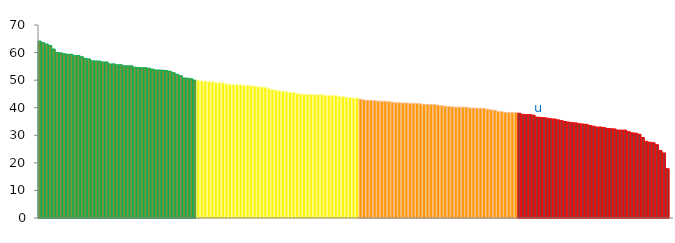
| Category | Top Quartile | 2nd Quartile | 3rd Quartile | Bottom Quartile | Series 4 |
|---|---|---|---|---|---|
|  | 64.2 | 0 | 0 | 0 | 64.2 |
|  | 63.6 | 0 | 0 | 0 | 63.6 |
|  | 63.1 | 0 | 0 | 0 | 63.1 |
|  | 62.6 | 0 | 0 | 0 | 62.6 |
|  | 61.3 | 0 | 0 | 0 | 61.3 |
|  | 60 | 0 | 0 | 0 | 60 |
|  | 59.9 | 0 | 0 | 0 | 59.9 |
|  | 59.6 | 0 | 0 | 0 | 59.6 |
|  | 59.4 | 0 | 0 | 0 | 59.4 |
|  | 59.4 | 0 | 0 | 0 | 59.4 |
|  | 58.9 | 0 | 0 | 0 | 58.9 |
|  | 58.9 | 0 | 0 | 0 | 58.9 |
|  | 58.5 | 0 | 0 | 0 | 58.5 |
|  | 57.9 | 0 | 0 | 0 | 57.9 |
|  | 57.7 | 0 | 0 | 0 | 57.7 |
|  | 57 | 0 | 0 | 0 | 57 |
|  | 57 | 0 | 0 | 0 | 57 |
|  | 56.9 | 0 | 0 | 0 | 56.9 |
|  | 56.6 | 0 | 0 | 0 | 56.6 |
|  | 56.6 | 0 | 0 | 0 | 56.6 |
|  | 55.9 | 0 | 0 | 0 | 55.9 |
|  | 55.9 | 0 | 0 | 0 | 55.9 |
|  | 55.6 | 0 | 0 | 0 | 55.6 |
|  | 55.6 | 0 | 0 | 0 | 55.6 |
|  | 55.2 | 0 | 0 | 0 | 55.2 |
|  | 55.2 | 0 | 0 | 0 | 55.2 |
|  | 55.2 | 0 | 0 | 0 | 55.2 |
|  | 54.7 | 0 | 0 | 0 | 54.7 |
|  | 54.6 | 0 | 0 | 0 | 54.6 |
|  | 54.5 | 0 | 0 | 0 | 54.5 |
|  | 54.5 | 0 | 0 | 0 | 54.5 |
|  | 54.3 | 0 | 0 | 0 | 54.3 |
|  | 54 | 0 | 0 | 0 | 54 |
|  | 53.7 | 0 | 0 | 0 | 53.7 |
|  | 53.7 | 0 | 0 | 0 | 53.7 |
|  | 53.6 | 0 | 0 | 0 | 53.6 |
|  | 53.5 | 0 | 0 | 0 | 53.5 |
|  | 53.2 | 0 | 0 | 0 | 53.2 |
|  | 52.7 | 0 | 0 | 0 | 52.7 |
|  | 52.1 | 0 | 0 | 0 | 52.1 |
|  | 51.6 | 0 | 0 | 0 | 51.6 |
|  | 50.8 | 0 | 0 | 0 | 50.8 |
|  | 50.7 | 0 | 0 | 0 | 50.7 |
|  | 50.5 | 0 | 0 | 0 | 50.5 |
|  | 50 | 0 | 0 | 0 | 50 |
|  | 0 | 49.9 | 0 | 0 | 49.9 |
|  | 0 | 49.7 | 0 | 0 | 49.7 |
|  | 0 | 49.6 | 0 | 0 | 49.6 |
|  | 0 | 49.4 | 0 | 0 | 49.4 |
|  | 0 | 49.4 | 0 | 0 | 49.4 |
|  | 0 | 49 | 0 | 0 | 49 |
|  | 0 | 49 | 0 | 0 | 49 |
|  | 0 | 49 | 0 | 0 | 49 |
|  | 0 | 48.6 | 0 | 0 | 48.6 |
|  | 0 | 48.4 | 0 | 0 | 48.4 |
|  | 0 | 48.4 | 0 | 0 | 48.4 |
|  | 0 | 48.3 | 0 | 0 | 48.3 |
|  | 0 | 48.3 | 0 | 0 | 48.3 |
|  | 0 | 48.1 | 0 | 0 | 48.1 |
|  | 0 | 48.1 | 0 | 0 | 48.1 |
|  | 0 | 48 | 0 | 0 | 48 |
|  | 0 | 47.8 | 0 | 0 | 47.8 |
|  | 0 | 47.6 | 0 | 0 | 47.6 |
|  | 0 | 47.5 | 0 | 0 | 47.5 |
|  | 0 | 47.4 | 0 | 0 | 47.4 |
|  | 0 | 46.9 | 0 | 0 | 46.9 |
|  | 0 | 46.5 | 0 | 0 | 46.5 |
|  | 0 | 46.4 | 0 | 0 | 46.4 |
|  | 0 | 46.1 | 0 | 0 | 46.1 |
|  | 0 | 45.9 | 0 | 0 | 45.9 |
|  | 0 | 45.8 | 0 | 0 | 45.8 |
|  | 0 | 45.5 | 0 | 0 | 45.5 |
|  | 0 | 45.5 | 0 | 0 | 45.5 |
|  | 0 | 45.1 | 0 | 0 | 45.1 |
|  | 0 | 45 | 0 | 0 | 45 |
|  | 0 | 44.9 | 0 | 0 | 44.9 |
|  | 0 | 44.8 | 0 | 0 | 44.8 |
|  | 0 | 44.8 | 0 | 0 | 44.8 |
|  | 0 | 44.7 | 0 | 0 | 44.7 |
|  | 0 | 44.7 | 0 | 0 | 44.7 |
|  | 0 | 44.7 | 0 | 0 | 44.7 |
|  | 0 | 44.5 | 0 | 0 | 44.5 |
|  | 0 | 44.5 | 0 | 0 | 44.5 |
|  | 0 | 44.4 | 0 | 0 | 44.4 |
|  | 0 | 44.4 | 0 | 0 | 44.4 |
|  | 0 | 44.1 | 0 | 0 | 44.1 |
|  | 0 | 44.1 | 0 | 0 | 44.1 |
|  | 0 | 43.8 | 0 | 0 | 43.8 |
|  | 0 | 43.7 | 0 | 0 | 43.7 |
|  | 0 | 43.5 | 0 | 0 | 43.5 |
|  | 0 | 43.5 | 0 | 0 | 43.5 |
|  | 0 | 0 | 43.1 | 0 | 43.1 |
|  | 0 | 0 | 42.8 | 0 | 42.8 |
|  | 0 | 0 | 42.7 | 0 | 42.7 |
|  | 0 | 0 | 42.6 | 0 | 42.6 |
|  | 0 | 0 | 42.5 | 0 | 42.5 |
|  | 0 | 0 | 42.4 | 0 | 42.4 |
|  | 0 | 0 | 42.3 | 0 | 42.3 |
|  | 0 | 0 | 42.3 | 0 | 42.3 |
|  | 0 | 0 | 42.2 | 0 | 42.2 |
|  | 0 | 0 | 42 | 0 | 42 |
|  | 0 | 0 | 41.8 | 0 | 41.8 |
|  | 0 | 0 | 41.8 | 0 | 41.8 |
|  | 0 | 0 | 41.7 | 0 | 41.7 |
|  | 0 | 0 | 41.7 | 0 | 41.7 |
|  | 0 | 0 | 41.6 | 0 | 41.6 |
|  | 0 | 0 | 41.6 | 0 | 41.6 |
|  | 0 | 0 | 41.5 | 0 | 41.5 |
|  | 0 | 0 | 41.4 | 0 | 41.4 |
|  | 0 | 0 | 41.2 | 0 | 41.2 |
|  | 0 | 0 | 41.2 | 0 | 41.2 |
|  | 0 | 0 | 41.1 | 0 | 41.1 |
|  | 0 | 0 | 41.1 | 0 | 41.1 |
|  | 0 | 0 | 40.9 | 0 | 40.9 |
|  | 0 | 0 | 40.7 | 0 | 40.7 |
|  | 0 | 0 | 40.5 | 0 | 40.5 |
|  | 0 | 0 | 40.4 | 0 | 40.4 |
|  | 0 | 0 | 40.3 | 0 | 40.3 |
|  | 0 | 0 | 40.2 | 0 | 40.2 |
|  | 0 | 0 | 40.2 | 0 | 40.2 |
|  | 0 | 0 | 40.2 | 0 | 40.2 |
|  | 0 | 0 | 40.2 | 0 | 40.2 |
|  | 0 | 0 | 39.9 | 0 | 39.9 |
|  | 0 | 0 | 39.9 | 0 | 39.9 |
|  | 0 | 0 | 39.8 | 0 | 39.8 |
|  | 0 | 0 | 39.8 | 0 | 39.8 |
|  | 0 | 0 | 39.7 | 0 | 39.7 |
|  | 0 | 0 | 39.5 | 0 | 39.5 |
|  | 0 | 0 | 39.2 | 0 | 39.2 |
|  | 0 | 0 | 39.1 | 0 | 39.1 |
|  | 0 | 0 | 38.6 | 0 | 38.6 |
|  | 0 | 0 | 38.5 | 0 | 38.5 |
|  | 0 | 0 | 38.3 | 0 | 38.3 |
|  | 0 | 0 | 38.2 | 0 | 38.2 |
|  | 0 | 0 | 38.2 | 0 | 38.2 |
|  | 0 | 0 | 38.2 | 0 | 38.2 |
|  | 0 | 0 | 0 | 38 | 38 |
|  | 0 | 0 | 0 | 37.6 | 37.6 |
|  | 0 | 0 | 0 | 37.5 | 37.5 |
|  | 0 | 0 | 0 | 37.5 | 37.5 |
|  | 0 | 0 | 0 | 37.3 | 37.3 |
|  | 0 | 0 | 0 | 36.6 | 36.6 |
| u | 0 | 0 | 0 | 36.5 | 36.5 |